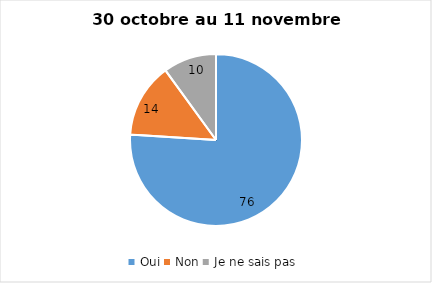
| Category | Series 0 |
|---|---|
| Oui | 76 |
| Non | 14 |
| Je ne sais pas | 10 |